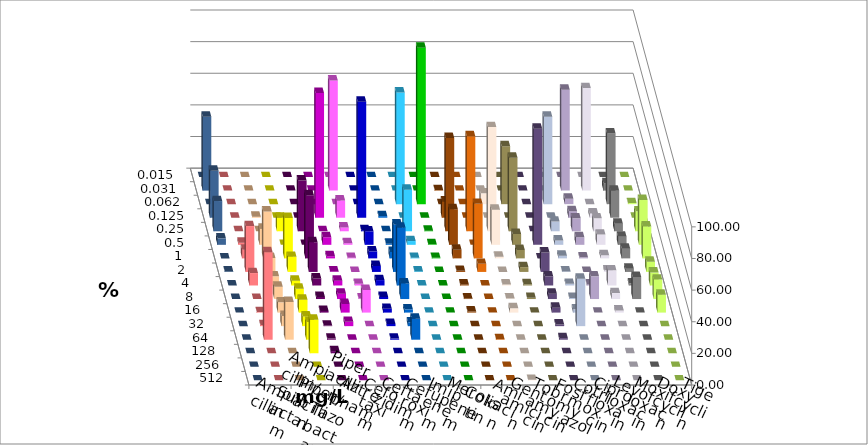
| Category | Ampicillin | Ampicillin/ Sulbactam | Piperacillin | Piperacillin/ Tazobactam | Aztreonam | Cefotaxim | Ceftazidim | Cefuroxim | Imipenem | Meropenem | Colistin | Amikacin | Gentamicin | Tobramycin | Fosfomycin | Cotrimoxazol | Ciprofloxacin | Levofloxacin | Moxifloxacin | Doxycyclin | Tigecyclin |
|---|---|---|---|---|---|---|---|---|---|---|---|---|---|---|---|---|---|---|---|---|---|
| 0.015 | 0 | 0 | 0 | 0 | 0 | 0 | 0 | 0 | 0 | 0 | 0 | 0 | 0 | 0 | 0 | 0 | 0 | 0 | 0 | 0 | 0 |
| 0.031 | 0 | 0 | 0 | 0 | 0 | 69.625 | 0 | 0 | 0 | 0 | 0.341 | 0 | 0 | 0 | 0 | 0 | 63.823 | 64.846 | 4.778 | 0 | 46.758 |
| 0.062 | 0 | 0 | 0 | 0 | 0 | 0 | 0 | 0 | 70.648 | 98.976 | 0 | 0 | 6.826 | 36.641 | 0 | 55.29 | 3.413 | 0 | 44.71 | 0.683 | 0 |
| 0.125 | 0 | 0.683 | 0 | 0 | 78.84 | 10.922 | 73.379 | 1.024 | 0 | 0 | 10.239 | 0 | 0 | 0 | 0 | 0 | 4.096 | 2.73 | 17.065 | 0 | 29.693 |
| 0.25 | 0 | 0 | 8.532 | 32.082 | 0 | 2.389 | 0.683 | 0 | 26.28 | 0.341 | 59.044 | 60.068 | 65.87 | 46.565 | 0 | 6.143 | 8.191 | 8.191 | 4.778 | 12.628 | 19.113 |
| 0.5 | 1.365 | 10.239 | 0 | 0 | 4.778 | 1.024 | 8.532 | 0.683 | 2.389 | 0.341 | 22.526 | 0 | 22.184 | 6.87 | 73.379 | 2.73 | 4.778 | 6.485 | 5.119 | 28.328 | 4.096 |
| 1.0 | 5.461 | 29.693 | 25.597 | 39.932 | 1.365 | 0.341 | 4.437 | 4.096 | 0.341 | 0.341 | 5.461 | 34.471 | 1.024 | 5.344 | 0 | 1.706 | 0.683 | 2.048 | 6.143 | 20.137 | 0 |
| 2.0 | 29.01 | 8.874 | 9.556 | 18.771 | 0.341 | 0 | 3.754 | 30.034 | 0.341 | 0 | 0.683 | 5.119 | 0 | 3.053 | 12.287 | 0.341 | 0 | 1.024 | 2.048 | 6.485 | 0.341 |
| 4.0 | 7.85 | 5.802 | 3.072 | 4.437 | 3.072 | 1.024 | 3.413 | 36.519 | 0 | 0 | 0.683 | 0 | 0.683 | 0.763 | 5.802 | 1.024 | 0.683 | 9.556 | 1.365 | 8.191 | 0 |
| 8.0 | 0 | 7.85 | 6.485 | 1.365 | 3.413 | 0.341 | 1.365 | 9.898 | 0 | 0 | 0.341 | 0 | 0.341 | 0.763 | 3.413 | 0.683 | 14.334 | 3.754 | 13.993 | 12.287 | 0 |
| 16.0 | 0.341 | 6.485 | 8.191 | 1.024 | 5.461 | 14.334 | 2.389 | 2.048 | 0 | 0 | 0.683 | 0 | 2.73 | 0 | 3.072 | 2.048 | 0 | 1.365 | 0 | 11.263 | 0 |
| 32.0 | 0.683 | 6.485 | 6.143 | 0.341 | 2.73 | 0 | 1.365 | 2.389 | 0 | 0 | 0 | 0 | 0 | 0 | 1.024 | 30.034 | 0 | 0 | 0 | 0 | 0 |
| 64.0 | 55.29 | 23.891 | 11.263 | 0.683 | 0 | 0 | 0.683 | 13.311 | 0 | 0 | 0 | 0.341 | 0 | 0 | 1.024 | 0 | 0 | 0 | 0 | 0 | 0 |
| 128.0 | 0 | 0 | 21.16 | 1.365 | 0 | 0 | 0 | 0 | 0 | 0 | 0 | 0 | 0 | 0 | 0 | 0 | 0 | 0 | 0 | 0 | 0 |
| 256.0 | 0 | 0 | 0 | 0 | 0 | 0 | 0 | 0 | 0 | 0 | 0 | 0 | 0 | 0 | 0 | 0 | 0 | 0 | 0 | 0 | 0 |
| 512.0 | 0 | 0 | 0 | 0 | 0 | 0 | 0 | 0 | 0 | 0 | 0 | 0 | 0.341 | 0 | 0 | 0 | 0 | 0 | 0 | 0 | 0 |